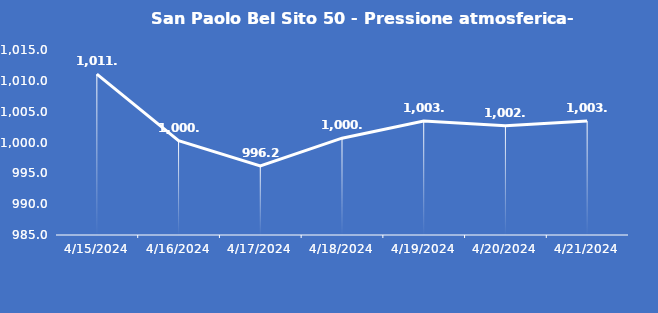
| Category | San Paolo Bel Sito 50 - Pressione atmosferica- Grezzo (hPa) |
|---|---|
| 4/15/24 | 1011.1 |
| 4/16/24 | 1000.3 |
| 4/17/24 | 996.2 |
| 4/18/24 | 1000.7 |
| 4/19/24 | 1003.5 |
| 4/20/24 | 1002.7 |
| 4/21/24 | 1003.5 |